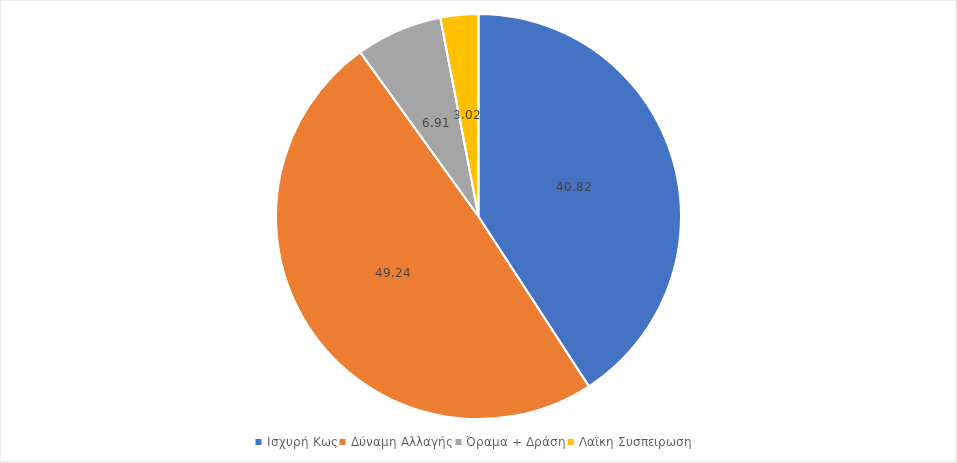
| Category | Series 0 |
|---|---|
| Ισχυρή Κως | 40.821 |
| Δύναμη Αλλαγής | 49.244 |
| Όραμα + Δράση | 6.911 |
| Λαϊκη Συσπειρωση | 3.024 |